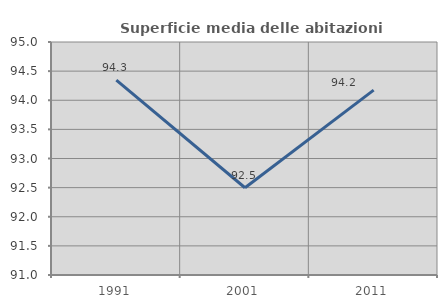
| Category | Superficie media delle abitazioni occupate |
|---|---|
| 1991.0 | 94.344 |
| 2001.0 | 92.497 |
| 2011.0 | 94.174 |